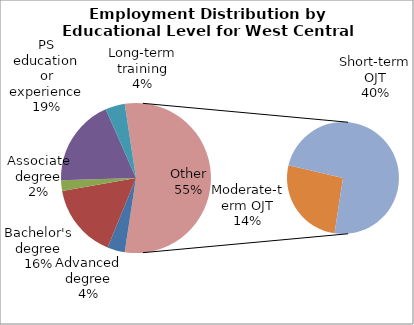
| Category | Series 0 |
|---|---|
| Advanced degree | 3150 |
| Bachelor's degree | 13380 |
| Associate degree | 1940 |
| PS education or experience | 15730 |
| Long-term training | 3500 |
| Moderate-term OJT | 12020 |
| Short-term OJT | 33740 |